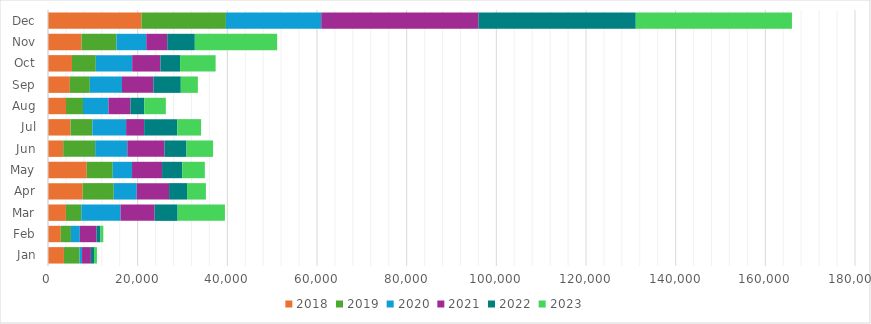
| Category | 2018 | 2019 | 2020 | 2021 | 2022 | 2023 |
|---|---|---|---|---|---|---|
| Jan | 3554 | 3469 | 566.9 | 1974.96 | 702.68 | 649.3 |
| Feb | 2845 | 2270 | 1979.97 | 3738.74 | 866.83 | 637.33 |
| Mar | 3994 | 3439 | 8745.71 | 7606 | 5126.11 | 10556.3 |
| Apr | 7740 | 6924 | 5127.26 | 7208.59 | 4015.7 | 4205.97 |
| May | 8645 | 5796 | 4301.64 | 6697.3 | 4491.04 | 5055.24 |
| Jun | 3390 | 7135 | 7172 | 8278.09 | 4919.35 | 5925.53 |
| Jul | 5028 | 4868 | 7525.4 | 4023.05 | 7395.18 | 5310.98 |
| Aug | 4016 | 3795 | 5674.63 | 4891.35 | 3115.34 | 4794.76 |
| Sep | 4876 | 4453 | 7170.59 | 6999.29 | 6121.59 | 3807.12 |
| Oct | 5346 | 5317 | 8112.16 | 6306.38 | 4376.64 | 7932.23 |
| Nov | 7485 | 7796 | 6631.73 | 4690.11 | 6144.64 | 18366 |
| Dec | 20843 | 18841 | 21260.27 | 35080.51 | 35075.82 | 34836.32 |